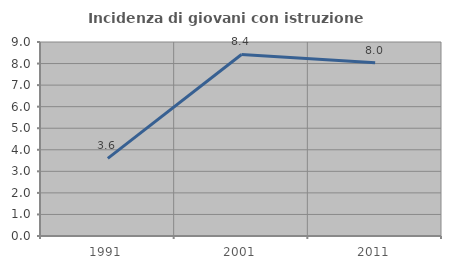
| Category | Incidenza di giovani con istruzione universitaria |
|---|---|
| 1991.0 | 3.604 |
| 2001.0 | 8.421 |
| 2011.0 | 8.036 |